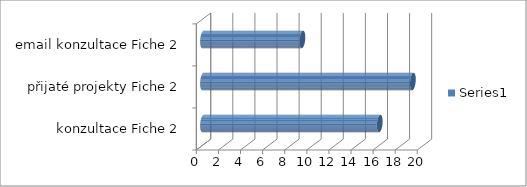
| Category | Series 0 |
|---|---|
|  konzultace Fiche 2 | 16 |
| přijaté projekty Fiche 2 | 19 |
| email konzultace Fiche 2 | 9 |